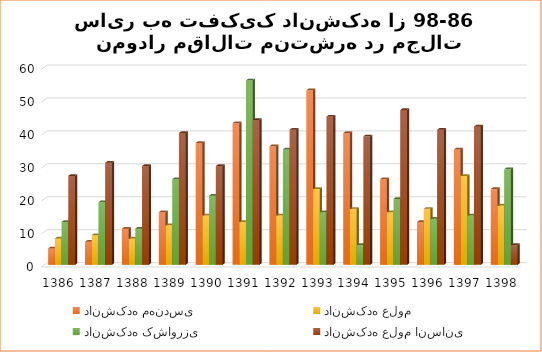
| Category | دانشکده مهندسی | دانشکده علوم | دانشکده کشاورزی | دانشکده علوم انسانی |
|---|---|---|---|---|
| 1386.0 | 5 | 8 | 13 | 27 |
| 1387.0 | 7 | 9 | 19 | 31 |
| 1388.0 | 11 | 8 | 11 | 30 |
| 1389.0 | 16 | 12 | 26 | 40 |
| 1390.0 | 37 | 15 | 21 | 30 |
| 1391.0 | 43 | 13 | 56 | 44 |
| 1392.0 | 36 | 15 | 35 | 41 |
| 1393.0 | 53 | 23 | 16 | 45 |
| 1394.0 | 40 | 17 | 6 | 39 |
| 1395.0 | 26 | 16 | 20 | 47 |
| 1396.0 | 13 | 17 | 14 | 41 |
| 1397.0 | 35 | 27 | 15 | 42 |
| 1398.0 | 23 | 18 | 29 | 6 |